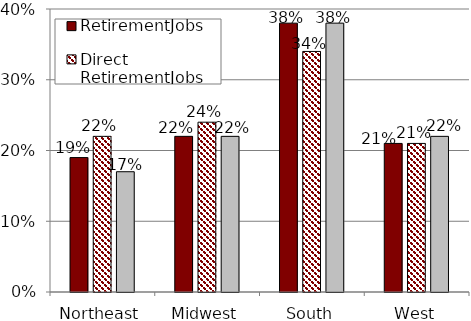
| Category | RetirementJobs | Direct RetirementJobs | JOLTS |
|---|---|---|---|
| Northeast | 0.19 | 0.22 | 0.17 |
| Midwest | 0.22 | 0.24 | 0.22 |
| South | 0.38 | 0.34 | 0.38 |
| West | 0.21 | 0.21 | 0.22 |